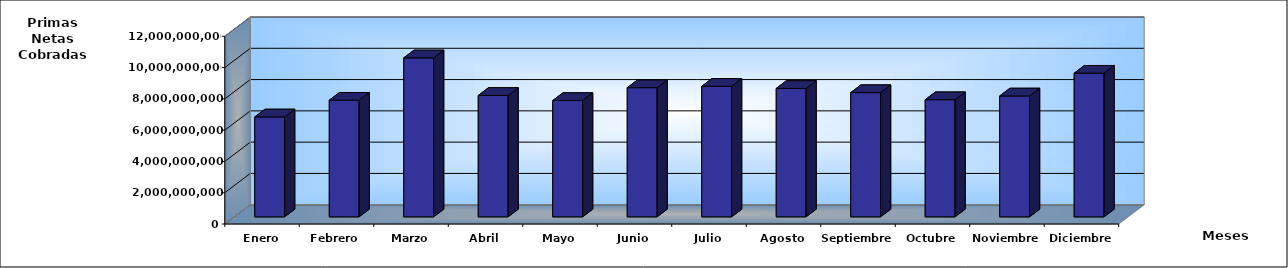
| Category | Series 0 |
|---|---|
| Enero | 6386792006.4 |
| Febrero | 7456840190.98 |
| Marzo | 10162365260.82 |
| Abril | 7761206749.68 |
| Mayo | 7435509101.11 |
| Junio | 8257516254.7 |
| Julio | 8345781339.21 |
| Agosto | 8209831253.5 |
| Septiembre | 7942146199.32 |
| Octubre | 7490213757.31 |
| Noviembre | 7728604139.29 |
| Diciembre | 9183030726.34 |